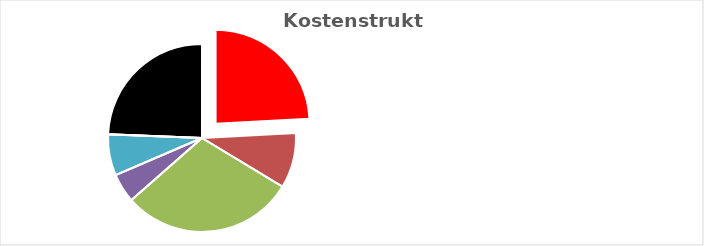
| Category | Series 0 |
|---|---|
| KV-Entgelt produktiv Tätige | 1 |
| Weitere Personalkosten produktiv | 0.392 |
| Personalnebenkosten | 1.235 |
| Unproduktives Personal | 0.208 |
| Deckung Personalgemeinkosten | 0.294 |
| Umlagen ohne GZ | 0 |
| Gesamtzuschlag | 1.008 |